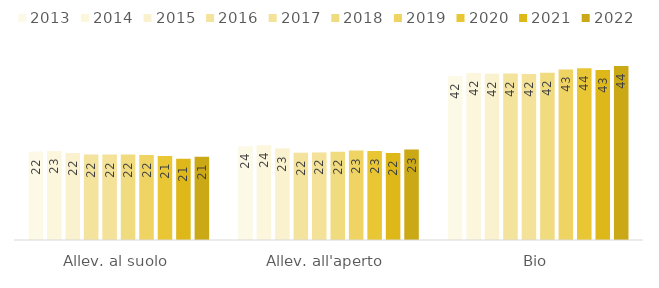
| Category | 2013 | 2014 | 2015 | 2016 | 2017 | 2018 | 2019 | 2020 | 2021 | 2022 |
|---|---|---|---|---|---|---|---|---|---|---|
| Allev. al suolo | 22.368 | 22.594 | 22.11 | 21.688 | 21.693 | 21.679 | 21.574 | 21.319 | 20.594 | 21.129 |
| Allev. all'aperto | 23.799 | 24.076 | 23.21 | 22.148 | 22.232 | 22.412 | 22.689 | 22.58 | 22.068 | 22.942 |
| Bio | 41.647 | 42.382 | 42.176 | 42.255 | 42.117 | 42.468 | 43.284 | 43.573 | 43.121 | 44.19 |